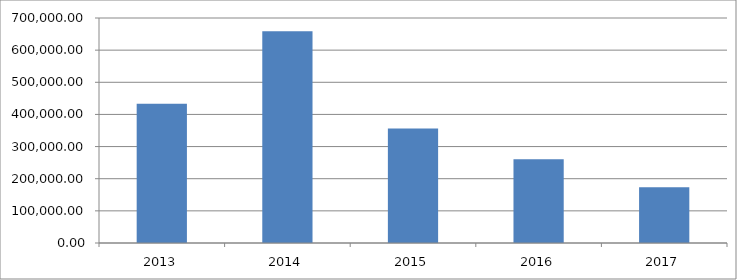
| Category | Series 0 |
|---|---|
| 2013.0 | 433211.104 |
| 2014.0 | 658478.034 |
| 2015.0 | 355853.463 |
| 2016.0 | 260877.623 |
| 2017.0 | 173355.014 |